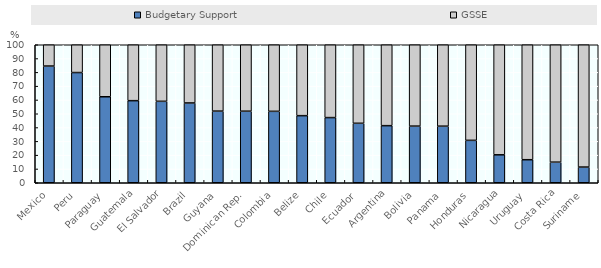
| Category | Budgetary Support | GSSE |
|---|---|---|
| Mexico | 84.579 | 15.421 |
| Peru | 79.864 | 20.136 |
| Paraguay | 62.316 | 37.684 |
| Guatemala | 59.488 | 40.512 |
| El Salvador | 59.014 | 40.986 |
| Brazil | 57.823 | 42.177 |
| Guyana | 51.92 | 48.08 |
| Dominican Rep. | 51.865 | 48.135 |
| Colombia | 51.763 | 48.237 |
| Belize | 48.618 | 51.382 |
| Chile | 47.223 | 52.777 |
| Ecuador | 43.1 | 56.9 |
| Argentina | 41.366 | 58.634 |
| Bolivia | 41.045 | 58.955 |
| Panama | 41.007 | 58.993 |
| Honduras | 30.731 | 69.269 |
| Nicaragua | 20.255 | 79.745 |
| Uruguay | 16.691 | 83.309 |
| Costa Rica | 14.926 | 85.074 |
| Suriname | 11.368 | 88.632 |